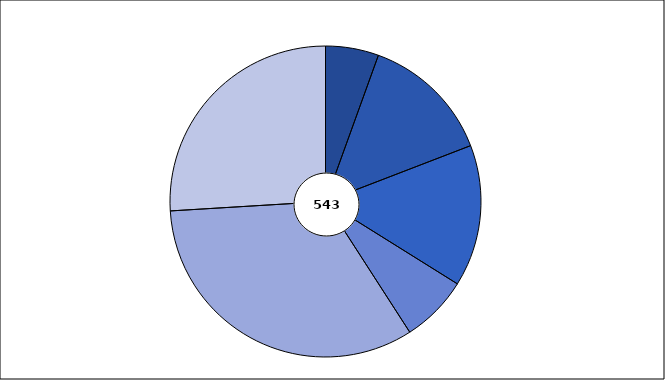
| Category | Series 1 |
|---|---|
| 0 | 30 |
| 1 | 74 |
| 2 | 80 |
| 3 | 38 |
| 4 | 180 |
| 5 | 141 |